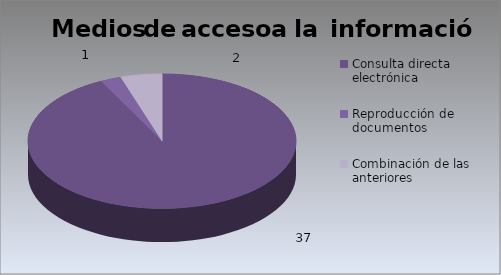
| Category | Series 0 |
|---|---|
| Consulta directa electrónica | 37 |
| Reproducción de documentos | 1 |
| Combinación de las anteriores | 2 |